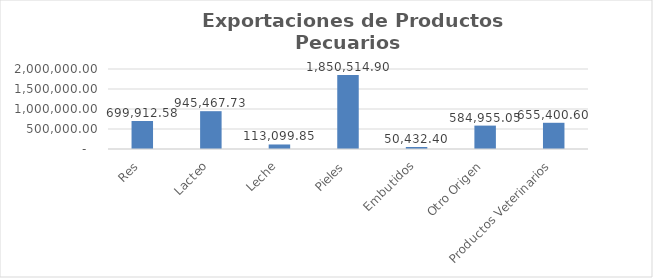
| Category | Valor US$ |
|---|---|
| Res | 699912.58 |
| Lacteo | 945467.73 |
| Leche | 113099.85 |
| Pieles | 1850514.9 |
| Embutidos | 50432.4 |
| Otro Origen | 584955.05 |
| Productos Veterinarios | 655400.6 |